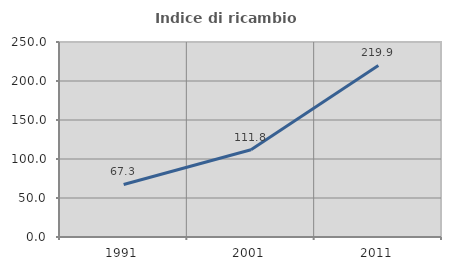
| Category | Indice di ricambio occupazionale  |
|---|---|
| 1991.0 | 67.312 |
| 2001.0 | 111.842 |
| 2011.0 | 219.919 |